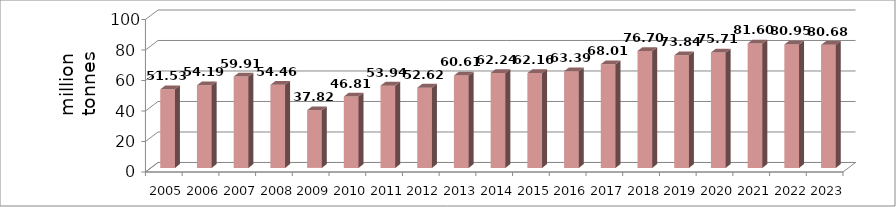
| Category | Series 1 |
|---|---|
| 2005.0 | 51.53 |
| 2006.0 | 54.19 |
| 2007.0 | 59.91 |
| 2008.0 | 54.46 |
| 2009.0 | 37.82 |
| 2010.0 | 46.81 |
| 2011.0 | 53.94 |
| 2012.0 | 52.62 |
| 2013.0 | 60.61 |
| 2014.0 | 62.24 |
| 2015.0 | 62.16 |
| 2016.0 | 63.388 |
| 2017.0 | 68.01 |
| 2018.0 | 76.7 |
| 2019.0 | 73.835 |
| 2020.0 | 75.71 |
| 2021.0 | 81.6 |
| 2022.0 | 80.95 |
| 2023.0 | 80.68 |